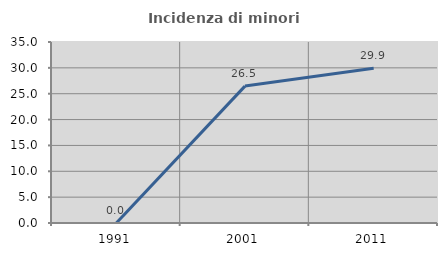
| Category | Incidenza di minori stranieri |
|---|---|
| 1991.0 | 0 |
| 2001.0 | 26.471 |
| 2011.0 | 29.915 |